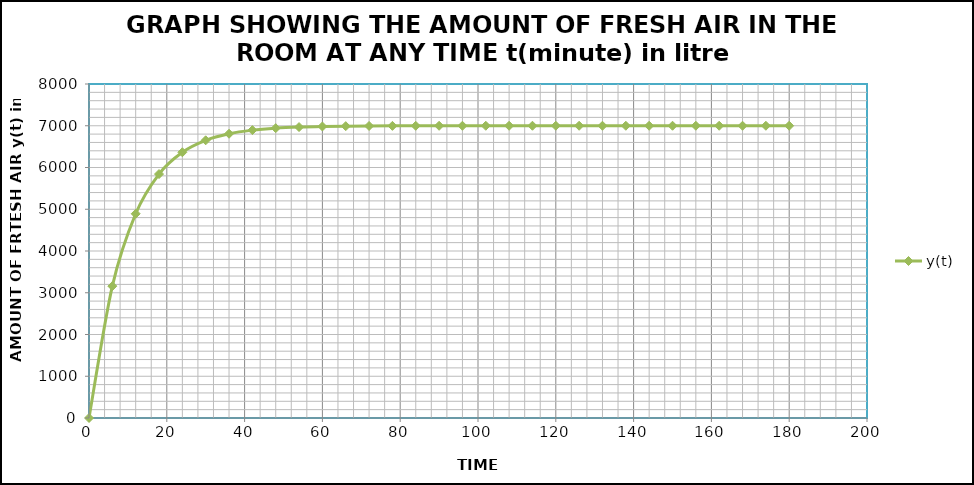
| Category | y(t) |
|---|---|
| 0.0 | 0 |
| 6.0 | 3158.319 |
| 12.0 | 4891.641 |
| 18.0 | 5842.908 |
| 24.0 | 6364.974 |
| 30.0 | 6651.491 |
| 36.0 | 6808.734 |
| 42.0 | 6895.031 |
| 48.0 | 6942.392 |
| 54.0 | 6968.384 |
| 60.0 | 6982.649 |
| 66.0 | 6990.477 |
| 72.0 | 6994.774 |
| 78.0 | 6997.132 |
| 84.0 | 6998.426 |
| 90.0 | 6999.136 |
| 96.0 | 6999.526 |
| 102.0 | 6999.74 |
| 108.0 | 6999.857 |
| 114.0 | 6999.922 |
| 120.0 | 6999.957 |
| 126.0 | 6999.976 |
| 132.0 | 6999.987 |
| 138.0 | 6999.993 |
| 144.0 | 6999.996 |
| 150.0 | 6999.998 |
| 156.0 | 6999.999 |
| 162.0 | 6999.999 |
| 168.0 | 7000 |
| 174.0 | 7000 |
| 180.0 | 7000 |